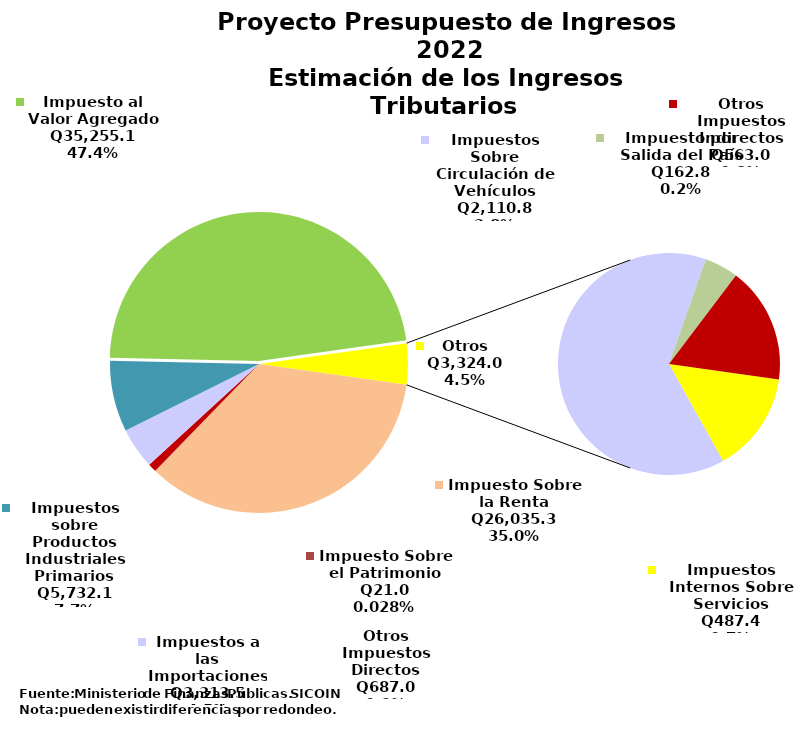
| Category | Series 0 |
|---|---|
| Impuesto Sobre la Renta | 26035.3 |
| Impuesto Sobre el Patrimonio | 21 |
| Otros Impuestos Directos | 687 |
| Impuestos a las Importaciones | 3313.5 |
| Impuestos sobre Productos Industriales Primarios | 5732.1 |
| Impuesto al Valor Agregado | 35255.1 |
| Impuestos Internos Sobre Servicios | 487.4 |
| Impuestos Sobre Circulación de Vehículos | 2110.8 |
| Impuesto por Salida del País | 162.8 |
| Otros Impuestos Indirectos | 563 |